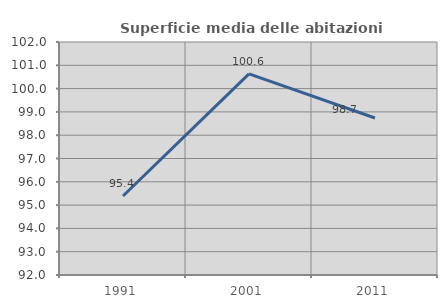
| Category | Superficie media delle abitazioni occupate |
|---|---|
| 1991.0 | 95.393 |
| 2001.0 | 100.632 |
| 2011.0 | 98.739 |